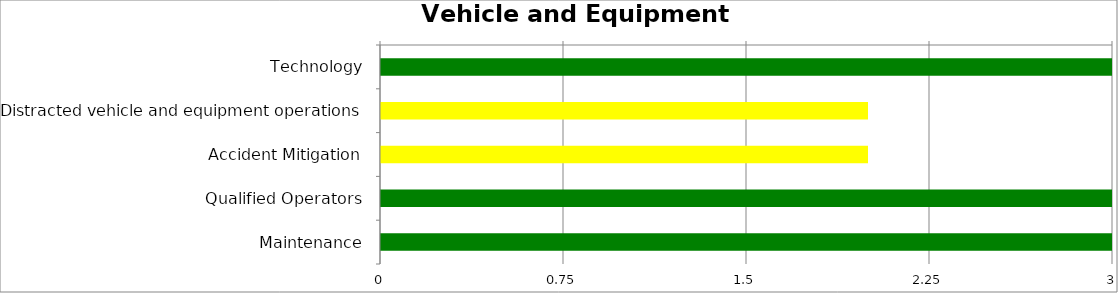
| Category | Low | Medium | High |
|---|---|---|---|
| Technology | 3 | 0 | 0 |
| Distracted vehicle and equipment operations | 0 | 2 | 0 |
| Accident Mitigation | 0 | 2 | 0 |
| Qualified Operators | 3 | 0 | 0 |
| Maintenance | 3 | 0 | 0 |